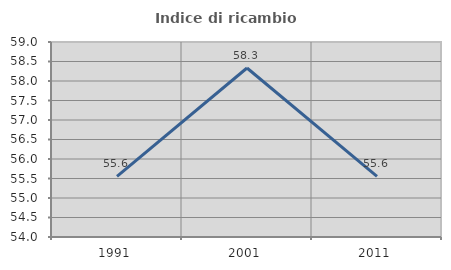
| Category | Indice di ricambio occupazionale  |
|---|---|
| 1991.0 | 55.556 |
| 2001.0 | 58.333 |
| 2011.0 | 55.556 |